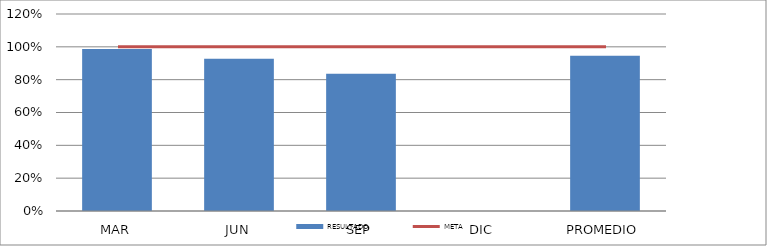
| Category | RESULTADO |
|---|---|
| MAR | 0.987 |
| JUN | 0.927 |
| SEP | 0.836 |
| DIC | 0 |
| PROMEDIO | 0.946 |